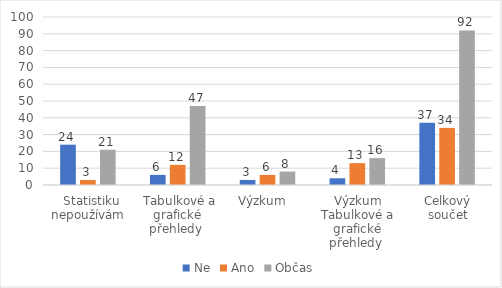
| Category | Ne | Ano | Občas |
|---|---|---|---|
|   Statistiku nepoužívám | 24 | 3 | 21 |
|  Tabulkové a grafické přehledy  | 6 | 12 | 47 |
| Výzkum   | 3 | 6 | 8 |
| Výzkum Tabulkové a grafické přehledy  | 4 | 13 | 16 |
| Celkový součet | 37 | 34 | 92 |